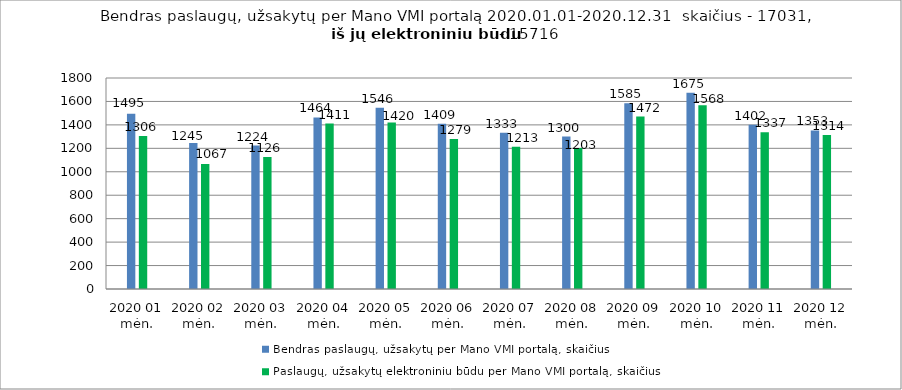
| Category | Bendras paslaugų, užsakytų per Mano VMI portalą, skaičius | Paslaugų, užsakytų elektroniniu būdu per Mano VMI portalą, skaičius |
|---|---|---|
| 2020 01 mėn. | 1495 | 1306 |
| 2020 02 mėn. | 1245 | 1067 |
| 2020 03 mėn. | 1224 | 1126 |
| 2020 04 mėn. | 1464 | 1411 |
| 2020 05 mėn. | 1546 | 1420 |
| 2020 06 mėn. | 1409 | 1279 |
| 2020 07 mėn. | 1333 | 1213 |
| 2020 08 mėn. | 1300 | 1203 |
| 2020 09 mėn. | 1585 | 1472 |
| 2020 10 mėn. | 1675 | 1568 |
| 2020 11 mėn. | 1402 | 1337 |
| 2020 12 mėn. | 1353 | 1314 |